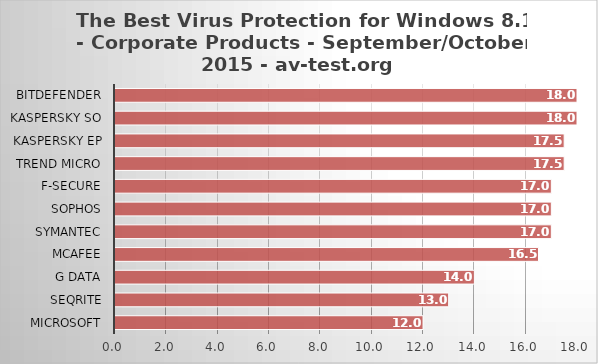
| Category | Series 0 |
|---|---|
| Microsoft | 12 |
| Seqrite | 13 |
| G Data | 14 |
| McAfee | 16.5 |
| Symantec | 17 |
| Sophos | 17 |
| F-Secure | 17 |
| Trend Micro | 17.5 |
| Kaspersky EP | 17.5 |
| Kaspersky SO | 18 |
| Bitdefender | 18 |